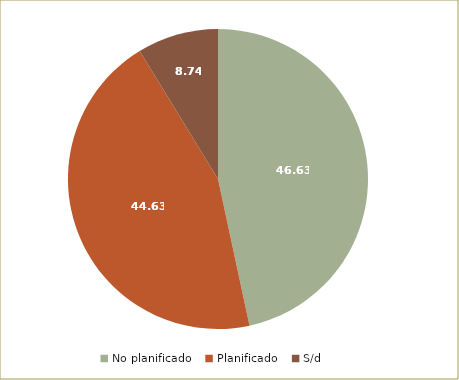
| Category | Series 0 |
|---|---|
| No planificado | 46.627 |
| Planificado | 44.63 |
| S/d | 8.743 |